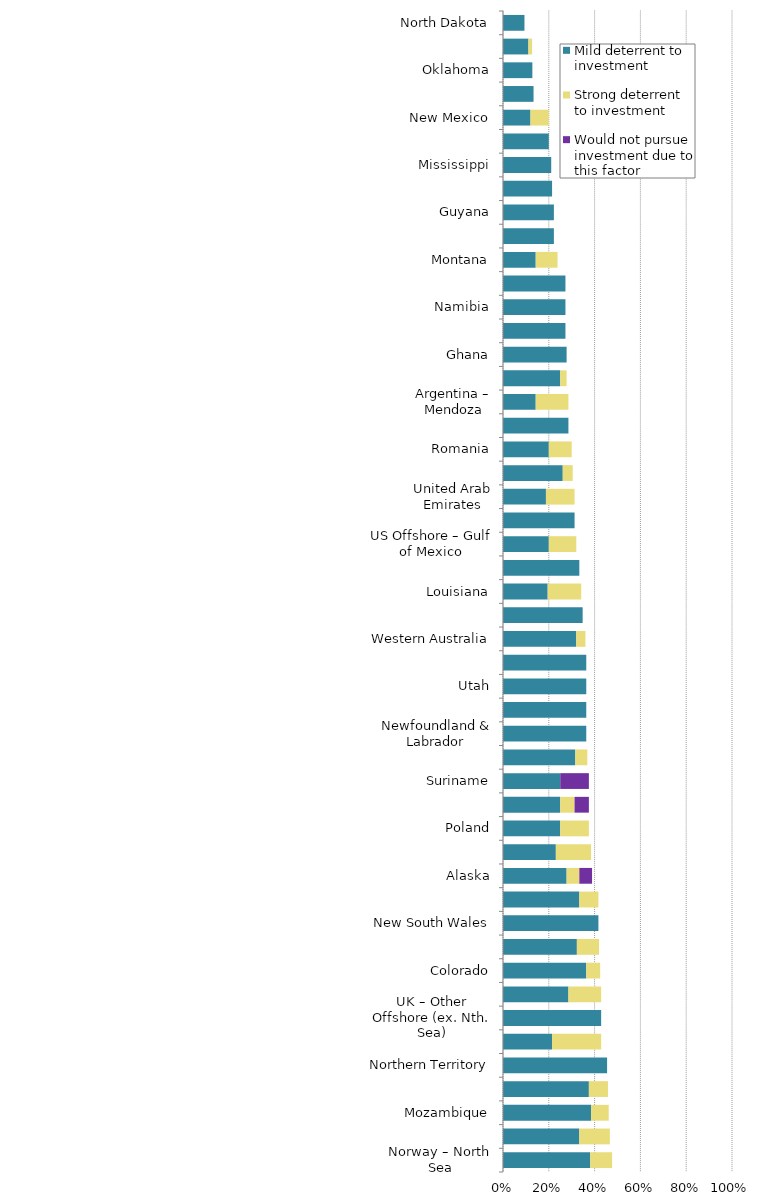
| Category | Mild deterrent to investment | Strong deterrent to investment | Would not pursue investment due to this factor |
|---|---|---|---|
| Norway – North Sea | 0.381 | 0.095 | 0 |
| Ohio | 0.333 | 0.133 | 0 |
| Mozambique | 0.385 | 0.077 | 0 |
| Australia – Offshore | 0.375 | 0.083 | 0 |
| Northern Territory | 0.455 | 0 | 0 |
| Michigan | 0.214 | 0.214 | 0 |
| UK – Other Offshore (ex. Nth. Sea) | 0.429 | 0 | 0 |
| Tanzania | 0.286 | 0.143 | 0 |
| Colorado | 0.364 | 0.061 | 0 |
| Colombia | 0.323 | 0.097 | 0 |
| New South Wales | 0.417 | 0 | 0 |
| Ireland | 0.333 | 0.083 | 0 |
| Alaska | 0.278 | 0.056 | 0.056 |
| Argentina – Neuquen | 0.231 | 0.154 | 0 |
| Poland | 0.25 | 0.125 | 0 |
| Tunisia | 0.25 | 0.062 | 0.062 |
| Suriname | 0.25 | 0 | 0.125 |
| Thailand | 0.316 | 0.053 | 0 |
| Newfoundland & Labrador | 0.364 | 0 | 0 |
| Alabama | 0.364 | 0 | 0 |
| Utah | 0.364 | 0 | 0 |
| West Virginia | 0.364 | 0 | 0 |
| Western Australia | 0.32 | 0.04 | 0 |
| United Kingdom – North Sea | 0.348 | 0 | 0 |
| Louisiana | 0.195 | 0.146 | 0 |
| Spain – Offshore | 0.333 | 0 | 0 |
| US Offshore – Gulf of Mexico | 0.2 | 0.12 | 0 |
| Manitoba | 0.312 | 0 | 0 |
| United Arab Emirates | 0.188 | 0.125 | 0 |
| Peru | 0.261 | 0.043 | 0 |
| Romania | 0.2 | 0.1 | 0 |
| South Australia | 0.286 | 0 | 0 |
| Argentina – Mendoza | 0.143 | 0.143 | 0 |
| Saskatchewan | 0.25 | 0.028 | 0 |
| Ghana | 0.278 | 0 | 0 |
| Arkansas | 0.273 | 0 | 0 |
| Namibia | 0.273 | 0 | 0 |
| Oman | 0.273 | 0 | 0 |
| Montana | 0.143 | 0.095 | 0 |
| Wyoming | 0.222 | 0 | 0 |
| Guyana | 0.222 | 0 | 0 |
| Netherlands | 0.214 | 0 | 0 |
| Mississippi | 0.211 | 0 | 0 |
| Kansas | 0.2 | 0 | 0 |
| New Mexico | 0.12 | 0.08 | 0 |
| New Zealand | 0.133 | 0 | 0 |
| Oklahoma | 0.128 | 0 | 0 |
| Texas | 0.111 | 0.016 | 0 |
| North Dakota | 0.094 | 0 | 0 |